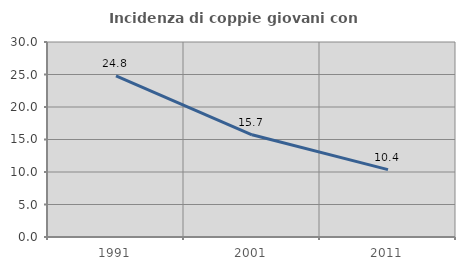
| Category | Incidenza di coppie giovani con figli |
|---|---|
| 1991.0 | 24.786 |
| 2001.0 | 15.719 |
| 2011.0 | 10.369 |